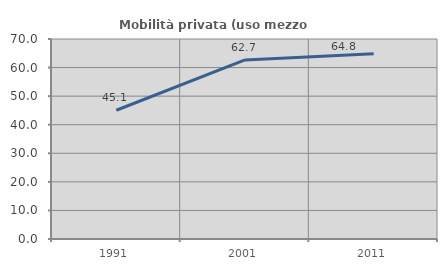
| Category | Mobilità privata (uso mezzo privato) |
|---|---|
| 1991.0 | 45.067 |
| 2001.0 | 62.67 |
| 2011.0 | 64.798 |